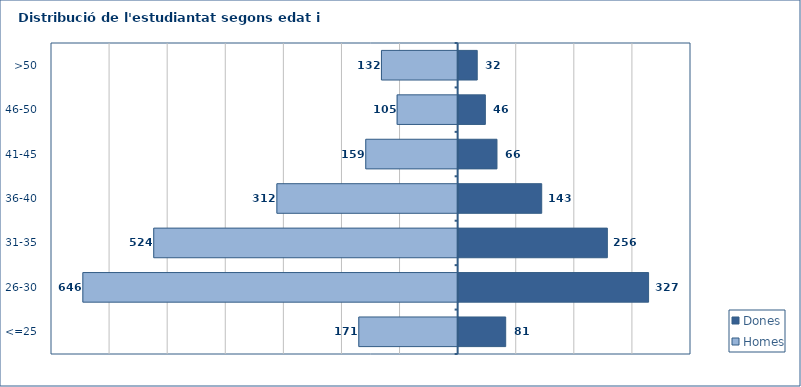
| Category | Homes | Dones |
|---|---|---|
| <=25 | -171 | 81 |
| 26-30 | -646 | 327 |
| 31-35 | -524 | 256 |
| 36-40 | -312 | 143 |
| 41-45 | -159 | 66 |
| 46-50 | -105 | 46 |
| >50 | -132 | 32 |